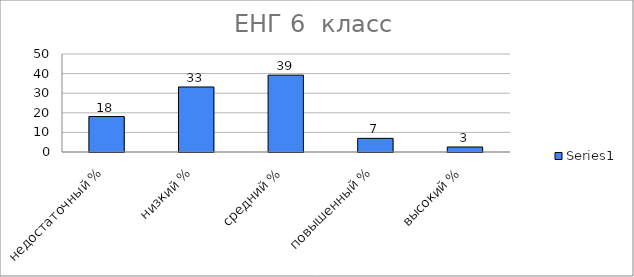
| Category | Series 0 |
|---|---|
| недостаточный % | 18.097 |
| низкий % | 33.179 |
| средний % | 39.211 |
| повышенный % | 6.961 |
| высокий % | 2.552 |